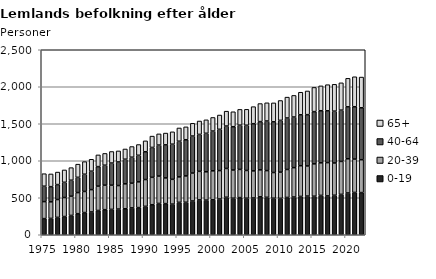
| Category | 0-19 | 20-39 | 40-64 | 65+ |
|---|---|---|---|---|
| 1975.0 | 218 | 230 | 208 | 169 |
| 1976.0 | 221 | 224 | 205 | 172 |
| 1977.0 | 235 | 241 | 202 | 169 |
| 1978.0 | 246 | 257 | 206 | 167 |
| 1979.0 | 261 | 260 | 216 | 170 |
| 1980.0 | 285 | 285 | 206 | 178 |
| 1981.0 | 300 | 285 | 233 | 170 |
| 1982.0 | 308 | 302 | 249 | 161 |
| 1983.0 | 328 | 329 | 264 | 158 |
| 1984.0 | 339 | 331 | 270 | 159 |
| 1985.0 | 343 | 327 | 299 | 156 |
| 1986.0 | 347 | 318 | 319 | 149 |
| 1987.0 | 351 | 337 | 333 | 138 |
| 1988.0 | 363 | 334 | 351 | 144 |
| 1989.0 | 367 | 348 | 359 | 145 |
| 1990.0 | 384 | 362 | 376 | 147 |
| 1991.0 | 406 | 370 | 404 | 153 |
| 1992.0 | 423 | 370 | 419 | 151 |
| 1993.0 | 421 | 347 | 447 | 159 |
| 1994.0 | 414 | 335 | 475 | 167 |
| 1995.0 | 438 | 344 | 482 | 179 |
| 1996.0 | 439 | 356 | 489 | 174 |
| 1997.0 | 456 | 378 | 500 | 172 |
| 1998.0 | 471 | 386 | 499 | 181 |
| 1999.0 | 468 | 383 | 520 | 182 |
| 2000.0 | 472 | 392 | 537 | 184 |
| 2001.0 | 483 | 384 | 558 | 193 |
| 2002.0 | 507 | 389 | 573 | 201 |
| 2003.0 | 494 | 381 | 585 | 202 |
| 2004.0 | 502 | 381 | 598 | 213 |
| 2005.0 | 494 | 375 | 611 | 215 |
| 2006.0 | 497 | 366 | 638 | 230 |
| 2007.0 | 513 | 364 | 652 | 244 |
| 2008.0 | 506 | 361 | 670 | 246 |
| 2009.0 | 494 | 347 | 685 | 256 |
| 2010.0 | 492 | 354 | 700 | 268 |
| 2011.0 | 504 | 378 | 696 | 282 |
| 2012.0 | 510 | 397 | 684 | 292 |
| 2013.0 | 518 | 415 | 688 | 305 |
| 2014.0 | 523 | 407 | 693 | 320 |
| 2015.0 | 521 | 437 | 706 | 327 |
| 2016.0 | 532 | 440 | 704 | 336 |
| 2017.0 | 525 | 450 | 700 | 353 |
| 2018.0 | 534 | 436 | 700 | 363 |
| 2019.0 | 546 | 445 | 693 | 369 |
| 2020.0 | 565 | 462 | 702 | 385 |
| 2021.0 | 572 | 451 | 707 | 405 |
| 2022.0 | 570 | 444 | 702 | 415 |